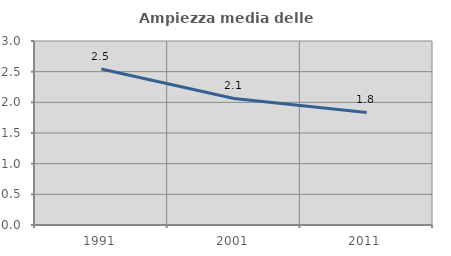
| Category | Ampiezza media delle famiglie |
|---|---|
| 1991.0 | 2.542 |
| 2001.0 | 2.063 |
| 2011.0 | 1.836 |